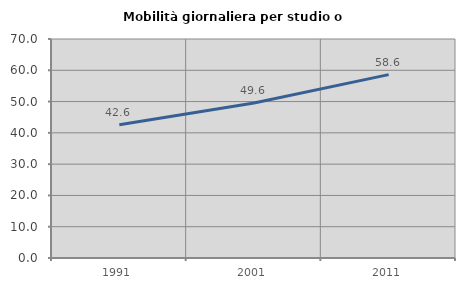
| Category | Mobilità giornaliera per studio o lavoro |
|---|---|
| 1991.0 | 42.609 |
| 2001.0 | 49.558 |
| 2011.0 | 58.621 |